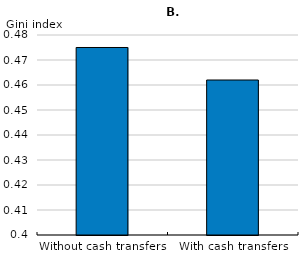
| Category | Gini |
|---|---|
| Without cash transfers | 0.475 |
| With cash transfers | 0.462 |